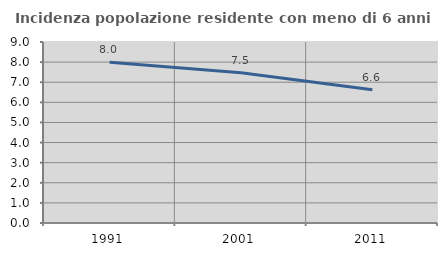
| Category | Incidenza popolazione residente con meno di 6 anni |
|---|---|
| 1991.0 | 7.994 |
| 2001.0 | 7.471 |
| 2011.0 | 6.624 |